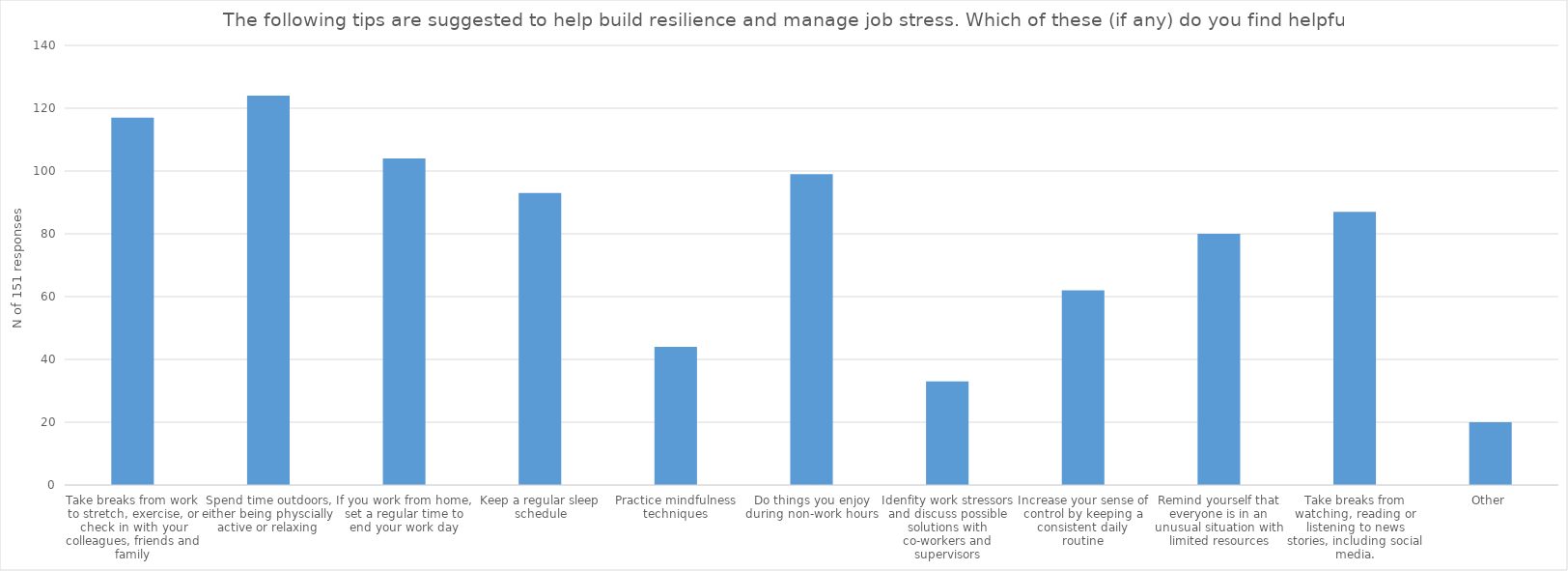
| Category | N of 151 responses |
|---|---|
| Take breaks from work to stretch, exercise, or check in with your colleagues, friends and family | 117 |
| Spend time outdoors, either being physcially active or relaxing | 124 |
| If you work from home, set a regular time to end your work day | 104 |
| Keep a regular sleep schedule | 93 |
| Practice mindfulness techniques | 44 |
| Do things you enjoy during non-work hours | 99 |
| Idenfity work stressors and discuss possible solutions with co-workers and supervisors | 33 |
| Increase your sense of control by keeping a consistent daily routine | 62 |
| Remind yourself that everyone is in an unusual situation with limited resources | 80 |
| Take breaks from watching, reading or listening to news stories, including social media. | 87 |
| Other | 20 |